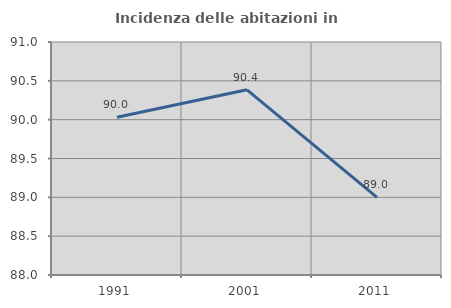
| Category | Incidenza delle abitazioni in proprietà  |
|---|---|
| 1991.0 | 90.032 |
| 2001.0 | 90.385 |
| 2011.0 | 89 |